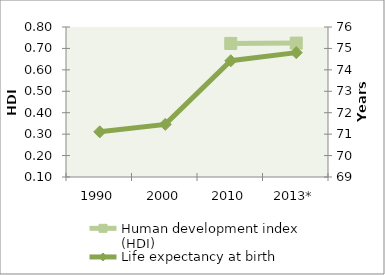
| Category | Human development index (HDI) |
|---|---|
| 1990 | 0 |
| 2000 | 0 |
| 2010 | 0.723 |
| 2013* | 0.725 |